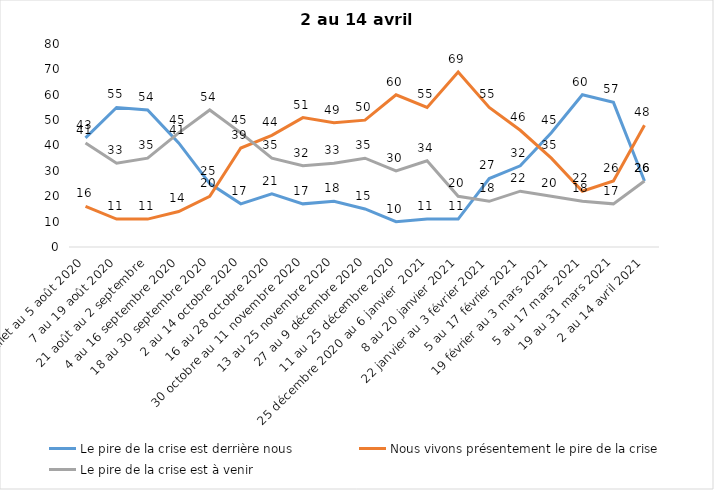
| Category | Le pire de la crise est derrière nous | Nous vivons présentement le pire de la crise | Le pire de la crise est à venir |
|---|---|---|---|
| 24 juillet au 5 août 2020 | 43 | 16 | 41 |
| 7 au 19 août 2020 | 55 | 11 | 33 |
| 21 août au 2 septembre | 54 | 11 | 35 |
| 4 au 16 septembre 2020 | 41 | 14 | 45 |
| 18 au 30 septembre 2020 | 25 | 20 | 54 |
| 2 au 14 octobre 2020 | 17 | 39 | 45 |
| 16 au 28 octobre 2020 | 21 | 44 | 35 |
| 30 octobre au 11 novembre 2020 | 17 | 51 | 32 |
| 13 au 25 novembre 2020 | 18 | 49 | 33 |
| 27 au 9 décembre 2020 | 15 | 50 | 35 |
| 11 au 25 décembre 2020 | 10 | 60 | 30 |
| 25 décembre 2020 au 6 janvier  2021 | 11 | 55 | 34 |
| 8 au 20 janvier 2021 | 11 | 69 | 20 |
| 22 janvier au 3 février 2021 | 27 | 55 | 18 |
| 5 au 17 février 2021 | 32 | 46 | 22 |
| 19 février au 3 mars 2021 | 45 | 35 | 20 |
| 5 au 17 mars 2021 | 60 | 22 | 18 |
| 19 au 31 mars 2021 | 57 | 26 | 17 |
| 2 au 14 avril 2021 | 26 | 48 | 26 |